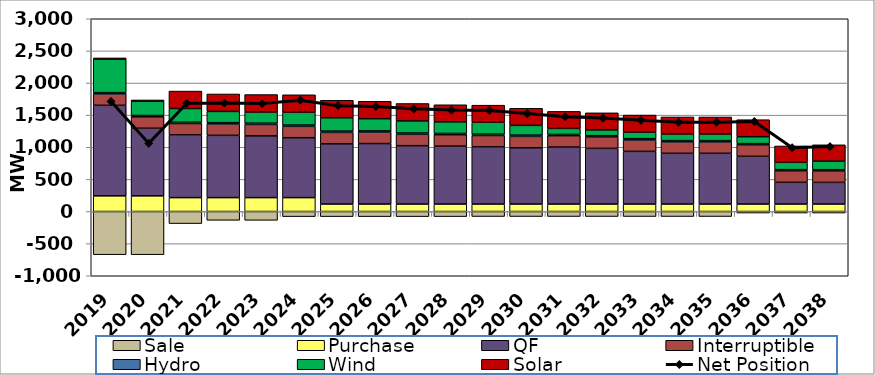
| Category | Sale | Purchase | QF | Interruptible | Hydro | Wind | Solar |
|---|---|---|---|---|---|---|---|
| 2019.0 | -672.22 | 243.53 | 1409.363 | 177.398 | 20.033 | 519.554 | 20.702 |
| 2020.0 | -672.22 | 243.53 | 1052.841 | 177.398 | 20.033 | 221.642 | 20.702 |
| 2021.0 | -187.8 | 215.97 | 976.224 | 177.398 | 20.033 | 213.27 | 271.765 |
| 2022.0 | -136.91 | 215.97 | 969.6 | 177.398 | 20.033 | 174.667 | 271.765 |
| 2023.0 | -136.92 | 215.97 | 961.424 | 177.398 | 20.033 | 173.564 | 271.765 |
| 2024.0 | -79.54 | 215.97 | 932.354 | 177.398 | 20.033 | 199.109 | 271.765 |
| 2025.0 | -79.54 | 115.95 | 937.859 | 177.398 | 20.033 | 208.005 | 271.765 |
| 2026.0 | -79.53 | 115.95 | 941.625 | 177.398 | 20.033 | 189.159 | 271.765 |
| 2027.0 | -79.54 | 115.95 | 908.466 | 177.398 | 20.033 | 187.416 | 271.765 |
| 2028.0 | -79.52 | 115.95 | 902.017 | 177.398 | 20.033 | 180.503 | 265.564 |
| 2029.0 | -78.01 | 115.95 | 889.744 | 177.398 | 20.033 | 186.457 | 265.564 |
| 2030.0 | -78 | 115.95 | 875.79 | 177.398 | 20.033 | 151.194 | 265.564 |
| 2031.0 | -77.99 | 115.95 | 886.81 | 177.398 | 20.033 | 92.77 | 265.274 |
| 2032.0 | -77.99 | 115.95 | 866.545 | 177.398 | 20.033 | 90.548 | 265.274 |
| 2033.0 | -78.01 | 115.95 | 820.137 | 177.398 | 20.033 | 102.201 | 265.274 |
| 2034.0 | -78 | 115.95 | 789.904 | 177.398 | 20.033 | 103.229 | 265.274 |
| 2035.0 | -77.99 | 115.95 | 789.701 | 177.398 | 20.033 | 102.872 | 265.274 |
| 2036.0 | -23.86 | 115.95 | 743.128 | 177.398 | 20.033 | 107.597 | 265.274 |
| 2037.0 | -23.86 | 115.95 | 338.314 | 177.398 | 20.033 | 113.939 | 254.501 |
| 2038.0 | -23.86 | 115.95 | 337.18 | 177.398 | 20.033 | 132.987 | 254.501 |